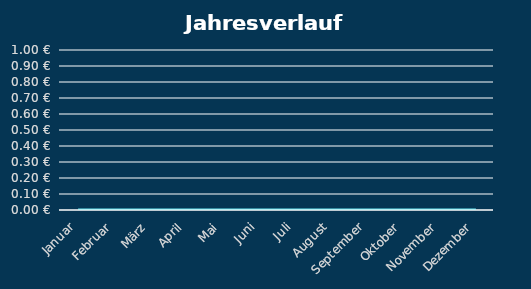
| Category | Series 0 |
|---|---|
| Januar | 0 |
| Februar | 0 |
| März | 0 |
| April | 0 |
| Mai | 0 |
| Juni | 0 |
| Juli | 0 |
| August | 0 |
| September | 0 |
| Oktober | 0 |
| November | 0 |
| Dezember | 0 |